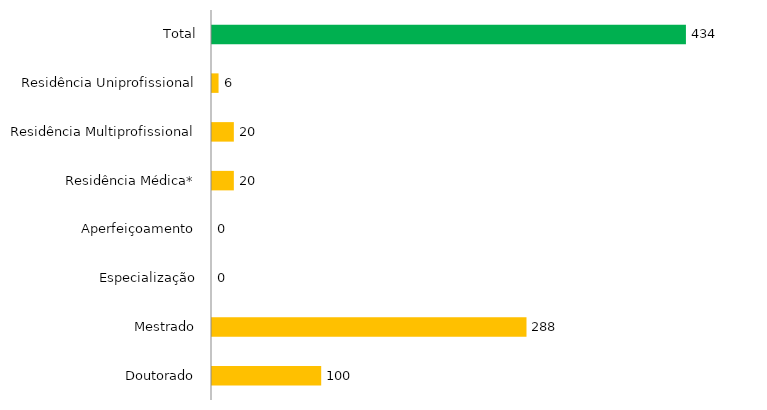
| Category | Pós - Graduação UFGD |
|---|---|
| Doutorado | 100 |
| Mestrado | 288 |
| Especialização | 0 |
| Aperfeiçoamento | 0 |
| Residência Médica* | 20 |
| Residência Multiprofissional | 20 |
| Residência Uniprofissional | 6 |
| Total | 434 |